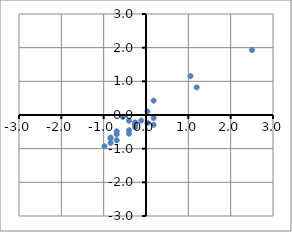
| Category | Series 0 |
|---|---|
| -0.2557538057398536 | -0.367 |
| -0.837012455148612 | -0.701 |
| -0.837012455148612 | -0.667 |
| -0.6916977927964224 | -0.483 |
| -0.4010684680920432 | -0.556 |
| -0.2557538057398536 | -0.275 |
| -0.9823271175008016 | -0.927 |
| -0.2557538057398536 | -0.293 |
| 3.086483428360507 | 3.662 |
| -0.5463831304442328 | -0.057 |
| 1.0520781554298526 | 1.156 |
| 0.1801901813167151 | -0.089 |
| -0.6916977927964224 | -0.572 |
| -0.4010684680920432 | -0.17 |
| 0.03487551896452553 | 0.104 |
| 0.1801901813167151 | 0.426 |
| -0.4010684680920432 | -0.453 |
| -0.2557538057398536 | -0.218 |
| -0.837012455148612 | -0.83 |
| 1.1973928177820423 | 0.819 |
| 0.1801901813167151 | -0.289 |
| 2.5052247789517486 | 1.928 |
| 0.03487551896452553 | -0.234 |
| -0.11043914338766406 | -0.165 |
| -0.6916977927964224 | -0.749 |